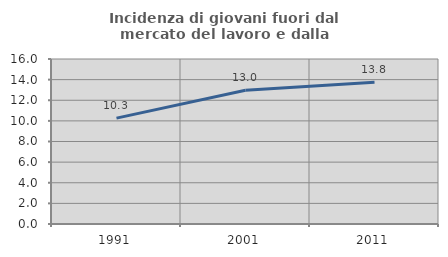
| Category | Incidenza di giovani fuori dal mercato del lavoro e dalla formazione  |
|---|---|
| 1991.0 | 10.264 |
| 2001.0 | 12.969 |
| 2011.0 | 13.755 |